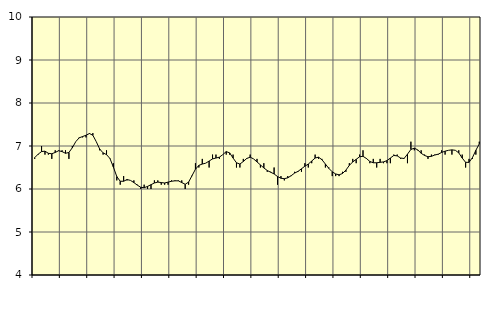
| Category | Piggar | Transport, SNI 49-53 |
|---|---|---|
| nan | 6.7 | 6.73 |
| 87.0 | 6.8 | 6.81 |
| 87.0 | 7 | 6.87 |
| 87.0 | 6.8 | 6.88 |
| nan | 6.8 | 6.83 |
| 88.0 | 6.7 | 6.82 |
| 88.0 | 6.9 | 6.85 |
| 88.0 | 6.9 | 6.89 |
| nan | 6.9 | 6.87 |
| 89.0 | 6.9 | 6.83 |
| 89.0 | 6.7 | 6.85 |
| 89.0 | 7 | 6.96 |
| nan | 7.1 | 7.1 |
| 90.0 | 7.2 | 7.19 |
| 90.0 | 7.2 | 7.22 |
| 90.0 | 7.2 | 7.25 |
| nan | 7.3 | 7.29 |
| 91.0 | 7.3 | 7.25 |
| 91.0 | 7.1 | 7.1 |
| 91.0 | 6.9 | 6.93 |
| nan | 6.8 | 6.84 |
| 92.0 | 6.9 | 6.8 |
| 92.0 | 6.7 | 6.71 |
| 92.0 | 6.6 | 6.51 |
| nan | 6.2 | 6.29 |
| 93.0 | 6.1 | 6.18 |
| 93.0 | 6.3 | 6.18 |
| 93.0 | 6.2 | 6.22 |
| nan | 6.2 | 6.2 |
| 94.0 | 6.2 | 6.15 |
| 94.0 | 6.1 | 6.09 |
| 94.0 | 6 | 6.04 |
| nan | 6.1 | 6.03 |
| 95.0 | 6 | 6.06 |
| 95.0 | 6 | 6.1 |
| 95.0 | 6.2 | 6.14 |
| nan | 6.2 | 6.16 |
| 96.0 | 6.1 | 6.15 |
| 96.0 | 6.1 | 6.14 |
| 96.0 | 6.1 | 6.16 |
| nan | 6.2 | 6.18 |
| 97.0 | 6.2 | 6.19 |
| 97.0 | 6.2 | 6.19 |
| 97.0 | 6.2 | 6.15 |
| nan | 6 | 6.11 |
| 98.0 | 6.1 | 6.16 |
| 98.0 | 6.3 | 6.31 |
| 98.0 | 6.6 | 6.46 |
| nan | 6.5 | 6.55 |
| 99.0 | 6.7 | 6.58 |
| 99.0 | 6.6 | 6.6 |
| 99.0 | 6.5 | 6.65 |
| nan | 6.8 | 6.7 |
| 0.0 | 6.8 | 6.72 |
| 0.0 | 6.7 | 6.74 |
| 0.0 | 6.8 | 6.8 |
| nan | 6.8 | 6.87 |
| 1.0 | 6.8 | 6.84 |
| 1.0 | 6.8 | 6.72 |
| 1.0 | 6.5 | 6.61 |
| nan | 6.5 | 6.58 |
| 2.0 | 6.7 | 6.64 |
| 2.0 | 6.7 | 6.71 |
| 2.0 | 6.8 | 6.74 |
| nan | 6.7 | 6.7 |
| 3.0 | 6.7 | 6.63 |
| 3.0 | 6.5 | 6.56 |
| 3.0 | 6.6 | 6.49 |
| nan | 6.4 | 6.43 |
| 4.0 | 6.4 | 6.39 |
| 4.0 | 6.5 | 6.35 |
| 4.0 | 6.1 | 6.29 |
| nan | 6.3 | 6.25 |
| 5.0 | 6.2 | 6.24 |
| 5.0 | 6.3 | 6.26 |
| 5.0 | 6.3 | 6.31 |
| nan | 6.4 | 6.37 |
| 6.0 | 6.4 | 6.41 |
| 6.0 | 6.4 | 6.47 |
| 6.0 | 6.6 | 6.53 |
| nan | 6.5 | 6.58 |
| 7.0 | 6.6 | 6.65 |
| 7.0 | 6.8 | 6.72 |
| 7.0 | 6.7 | 6.74 |
| nan | 6.7 | 6.68 |
| 8.0 | 6.5 | 6.58 |
| 8.0 | 6.5 | 6.48 |
| 8.0 | 6.3 | 6.4 |
| nan | 6.3 | 6.35 |
| 9.0 | 6.3 | 6.33 |
| 9.0 | 6.4 | 6.36 |
| 9.0 | 6.4 | 6.44 |
| nan | 6.6 | 6.55 |
| 10.0 | 6.7 | 6.63 |
| 10.0 | 6.6 | 6.69 |
| 10.0 | 6.8 | 6.75 |
| nan | 6.9 | 6.76 |
| 11.0 | 6.7 | 6.71 |
| 11.0 | 6.6 | 6.64 |
| 11.0 | 6.7 | 6.61 |
| nan | 6.5 | 6.61 |
| 12.0 | 6.7 | 6.62 |
| 12.0 | 6.6 | 6.63 |
| 12.0 | 6.6 | 6.66 |
| nan | 6.6 | 6.72 |
| 13.0 | 6.8 | 6.78 |
| 13.0 | 6.8 | 6.77 |
| 13.0 | 6.7 | 6.72 |
| nan | 6.7 | 6.71 |
| 14.0 | 6.6 | 6.81 |
| 14.0 | 7.1 | 6.92 |
| 14.0 | 6.9 | 6.95 |
| nan | 6.9 | 6.91 |
| 15.0 | 6.9 | 6.83 |
| 15.0 | 6.8 | 6.78 |
| 15.0 | 6.7 | 6.75 |
| nan | 6.8 | 6.76 |
| 16.0 | 6.8 | 6.79 |
| 16.0 | 6.8 | 6.81 |
| 16.0 | 6.9 | 6.85 |
| nan | 6.8 | 6.88 |
| 17.0 | 6.9 | 6.9 |
| 17.0 | 6.8 | 6.91 |
| 17.0 | 6.9 | 6.9 |
| nan | 6.9 | 6.84 |
| 18.0 | 6.8 | 6.72 |
| 18.0 | 6.5 | 6.62 |
| 18.0 | 6.7 | 6.62 |
| nan | 6.7 | 6.73 |
| 19.0 | 6.8 | 6.9 |
| 19.0 | 7.1 | 7.05 |